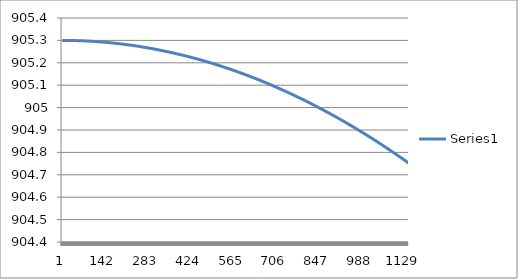
| Category | Series 0 |
|---|---|
| 0 | 905.3 |
| 1 | 905.3 |
| 2 | 905.3 |
| 3 | 905.3 |
| 4 | 905.3 |
| 5 | 905.3 |
| 6 | 905.3 |
| 7 | 905.3 |
| 8 | 905.3 |
| 9 | 905.3 |
| 10 | 905.3 |
| 11 | 905.3 |
| 12 | 905.3 |
| 13 | 905.3 |
| 14 | 905.3 |
| 15 | 905.3 |
| 16 | 905.3 |
| 17 | 905.3 |
| 18 | 905.3 |
| 19 | 905.3 |
| 20 | 905.3 |
| 21 | 905.3 |
| 22 | 905.3 |
| 23 | 905.3 |
| 24 | 905.3 |
| 25 | 905.3 |
| 26 | 905.3 |
| 27 | 905.3 |
| 28 | 905.3 |
| 29 | 905.3 |
| 30 | 905.3 |
| 31 | 905.3 |
| 32 | 905.3 |
| 33 | 905.3 |
| 34 | 905.3 |
| 35 | 905.299 |
| 36 | 905.299 |
| 37 | 905.299 |
| 38 | 905.299 |
| 39 | 905.299 |
| 40 | 905.299 |
| 41 | 905.299 |
| 42 | 905.299 |
| 43 | 905.299 |
| 44 | 905.299 |
| 45 | 905.299 |
| 46 | 905.299 |
| 47 | 905.299 |
| 48 | 905.299 |
| 49 | 905.299 |
| 50 | 905.299 |
| 51 | 905.299 |
| 52 | 905.299 |
| 53 | 905.299 |
| 54 | 905.299 |
| 55 | 905.299 |
| 56 | 905.299 |
| 57 | 905.299 |
| 58 | 905.299 |
| 59 | 905.299 |
| 60 | 905.299 |
| 61 | 905.298 |
| 62 | 905.298 |
| 63 | 905.298 |
| 64 | 905.298 |
| 65 | 905.298 |
| 66 | 905.298 |
| 67 | 905.298 |
| 68 | 905.298 |
| 69 | 905.298 |
| 70 | 905.298 |
| 71 | 905.298 |
| 72 | 905.298 |
| 73 | 905.298 |
| 74 | 905.298 |
| 75 | 905.298 |
| 76 | 905.298 |
| 77 | 905.298 |
| 78 | 905.297 |
| 79 | 905.297 |
| 80 | 905.297 |
| 81 | 905.297 |
| 82 | 905.297 |
| 83 | 905.297 |
| 84 | 905.297 |
| 85 | 905.297 |
| 86 | 905.297 |
| 87 | 905.297 |
| 88 | 905.297 |
| 89 | 905.297 |
| 90 | 905.297 |
| 91 | 905.297 |
| 92 | 905.296 |
| 93 | 905.296 |
| 94 | 905.296 |
| 95 | 905.296 |
| 96 | 905.296 |
| 97 | 905.296 |
| 98 | 905.296 |
| 99 | 905.296 |
| 100 | 905.296 |
| 101 | 905.296 |
| 102 | 905.296 |
| 103 | 905.296 |
| 104 | 905.295 |
| 105 | 905.295 |
| 106 | 905.295 |
| 107 | 905.295 |
| 108 | 905.295 |
| 109 | 905.295 |
| 110 | 905.295 |
| 111 | 905.295 |
| 112 | 905.295 |
| 113 | 905.295 |
| 114 | 905.295 |
| 115 | 905.294 |
| 116 | 905.294 |
| 117 | 905.294 |
| 118 | 905.294 |
| 119 | 905.294 |
| 120 | 905.294 |
| 121 | 905.294 |
| 122 | 905.294 |
| 123 | 905.294 |
| 124 | 905.294 |
| 125 | 905.293 |
| 126 | 905.293 |
| 127 | 905.293 |
| 128 | 905.293 |
| 129 | 905.293 |
| 130 | 905.293 |
| 131 | 905.293 |
| 132 | 905.293 |
| 133 | 905.293 |
| 134 | 905.292 |
| 135 | 905.292 |
| 136 | 905.292 |
| 137 | 905.292 |
| 138 | 905.292 |
| 139 | 905.292 |
| 140 | 905.292 |
| 141 | 905.292 |
| 142 | 905.292 |
| 143 | 905.291 |
| 144 | 905.291 |
| 145 | 905.291 |
| 146 | 905.291 |
| 147 | 905.291 |
| 148 | 905.291 |
| 149 | 905.291 |
| 150 | 905.291 |
| 151 | 905.29 |
| 152 | 905.29 |
| 153 | 905.29 |
| 154 | 905.29 |
| 155 | 905.29 |
| 156 | 905.29 |
| 157 | 905.29 |
| 158 | 905.29 |
| 159 | 905.289 |
| 160 | 905.289 |
| 161 | 905.289 |
| 162 | 905.289 |
| 163 | 905.289 |
| 164 | 905.289 |
| 165 | 905.289 |
| 166 | 905.288 |
| 167 | 905.288 |
| 168 | 905.288 |
| 169 | 905.288 |
| 170 | 905.288 |
| 171 | 905.288 |
| 172 | 905.288 |
| 173 | 905.287 |
| 174 | 905.287 |
| 175 | 905.287 |
| 176 | 905.287 |
| 177 | 905.287 |
| 178 | 905.287 |
| 179 | 905.287 |
| 180 | 905.286 |
| 181 | 905.286 |
| 182 | 905.286 |
| 183 | 905.286 |
| 184 | 905.286 |
| 185 | 905.286 |
| 186 | 905.286 |
| 187 | 905.285 |
| 188 | 905.285 |
| 189 | 905.285 |
| 190 | 905.285 |
| 191 | 905.285 |
| 192 | 905.285 |
| 193 | 905.284 |
| 194 | 905.284 |
| 195 | 905.284 |
| 196 | 905.284 |
| 197 | 905.284 |
| 198 | 905.284 |
| 199 | 905.283 |
| 200 | 905.283 |
| 201 | 905.283 |
| 202 | 905.283 |
| 203 | 905.283 |
| 204 | 905.283 |
| 205 | 905.282 |
| 206 | 905.282 |
| 207 | 905.282 |
| 208 | 905.282 |
| 209 | 905.282 |
| 210 | 905.282 |
| 211 | 905.281 |
| 212 | 905.281 |
| 213 | 905.281 |
| 214 | 905.281 |
| 215 | 905.281 |
| 216 | 905.28 |
| 217 | 905.28 |
| 218 | 905.28 |
| 219 | 905.28 |
| 220 | 905.28 |
| 221 | 905.28 |
| 222 | 905.279 |
| 223 | 905.279 |
| 224 | 905.279 |
| 225 | 905.279 |
| 226 | 905.279 |
| 227 | 905.278 |
| 228 | 905.278 |
| 229 | 905.278 |
| 230 | 905.278 |
| 231 | 905.278 |
| 232 | 905.277 |
| 233 | 905.277 |
| 234 | 905.277 |
| 235 | 905.277 |
| 236 | 905.277 |
| 237 | 905.276 |
| 238 | 905.276 |
| 239 | 905.276 |
| 240 | 905.276 |
| 241 | 905.276 |
| 242 | 905.275 |
| 243 | 905.275 |
| 244 | 905.275 |
| 245 | 905.275 |
| 246 | 905.275 |
| 247 | 905.274 |
| 248 | 905.274 |
| 249 | 905.274 |
| 250 | 905.274 |
| 251 | 905.274 |
| 252 | 905.273 |
| 253 | 905.273 |
| 254 | 905.273 |
| 255 | 905.273 |
| 256 | 905.273 |
| 257 | 905.272 |
| 258 | 905.272 |
| 259 | 905.272 |
| 260 | 905.272 |
| 261 | 905.271 |
| 262 | 905.271 |
| 263 | 905.271 |
| 264 | 905.271 |
| 265 | 905.271 |
| 266 | 905.27 |
| 267 | 905.27 |
| 268 | 905.27 |
| 269 | 905.27 |
| 270 | 905.269 |
| 271 | 905.269 |
| 272 | 905.269 |
| 273 | 905.269 |
| 274 | 905.269 |
| 275 | 905.268 |
| 276 | 905.268 |
| 277 | 905.268 |
| 278 | 905.268 |
| 279 | 905.267 |
| 280 | 905.267 |
| 281 | 905.267 |
| 282 | 905.267 |
| 283 | 905.266 |
| 284 | 905.266 |
| 285 | 905.266 |
| 286 | 905.266 |
| 287 | 905.265 |
| 288 | 905.265 |
| 289 | 905.265 |
| 290 | 905.265 |
| 291 | 905.264 |
| 292 | 905.264 |
| 293 | 905.264 |
| 294 | 905.264 |
| 295 | 905.263 |
| 296 | 905.263 |
| 297 | 905.263 |
| 298 | 905.263 |
| 299 | 905.262 |
| 300 | 905.262 |
| 301 | 905.262 |
| 302 | 905.262 |
| 303 | 905.261 |
| 304 | 905.261 |
| 305 | 905.261 |
| 306 | 905.261 |
| 307 | 905.26 |
| 308 | 905.26 |
| 309 | 905.26 |
| 310 | 905.26 |
| 311 | 905.259 |
| 312 | 905.259 |
| 313 | 905.259 |
| 314 | 905.259 |
| 315 | 905.258 |
| 316 | 905.258 |
| 317 | 905.258 |
| 318 | 905.258 |
| 319 | 905.257 |
| 320 | 905.257 |
| 321 | 905.257 |
| 322 | 905.256 |
| 323 | 905.256 |
| 324 | 905.256 |
| 325 | 905.256 |
| 326 | 905.255 |
| 327 | 905.255 |
| 328 | 905.255 |
| 329 | 905.255 |
| 330 | 905.254 |
| 331 | 905.254 |
| 332 | 905.254 |
| 333 | 905.253 |
| 334 | 905.253 |
| 335 | 905.253 |
| 336 | 905.253 |
| 337 | 905.252 |
| 338 | 905.252 |
| 339 | 905.252 |
| 340 | 905.251 |
| 341 | 905.251 |
| 342 | 905.251 |
| 343 | 905.251 |
| 344 | 905.25 |
| 345 | 905.25 |
| 346 | 905.25 |
| 347 | 905.249 |
| 348 | 905.249 |
| 349 | 905.249 |
| 350 | 905.249 |
| 351 | 905.248 |
| 352 | 905.248 |
| 353 | 905.248 |
| 354 | 905.247 |
| 355 | 905.247 |
| 356 | 905.247 |
| 357 | 905.246 |
| 358 | 905.246 |
| 359 | 905.246 |
| 360 | 905.246 |
| 361 | 905.245 |
| 362 | 905.245 |
| 363 | 905.245 |
| 364 | 905.244 |
| 365 | 905.244 |
| 366 | 905.244 |
| 367 | 905.243 |
| 368 | 905.243 |
| 369 | 905.243 |
| 370 | 905.243 |
| 371 | 905.242 |
| 372 | 905.242 |
| 373 | 905.242 |
| 374 | 905.241 |
| 375 | 905.241 |
| 376 | 905.241 |
| 377 | 905.24 |
| 378 | 905.24 |
| 379 | 905.24 |
| 380 | 905.239 |
| 381 | 905.239 |
| 382 | 905.239 |
| 383 | 905.238 |
| 384 | 905.238 |
| 385 | 905.238 |
| 386 | 905.237 |
| 387 | 905.237 |
| 388 | 905.237 |
| 389 | 905.236 |
| 390 | 905.236 |
| 391 | 905.236 |
| 392 | 905.235 |
| 393 | 905.235 |
| 394 | 905.235 |
| 395 | 905.234 |
| 396 | 905.234 |
| 397 | 905.234 |
| 398 | 905.233 |
| 399 | 905.233 |
| 400 | 905.233 |
| 401 | 905.232 |
| 402 | 905.232 |
| 403 | 905.232 |
| 404 | 905.231 |
| 405 | 905.231 |
| 406 | 905.231 |
| 407 | 905.23 |
| 408 | 905.23 |
| 409 | 905.23 |
| 410 | 905.229 |
| 411 | 905.229 |
| 412 | 905.229 |
| 413 | 905.228 |
| 414 | 905.228 |
| 415 | 905.228 |
| 416 | 905.227 |
| 417 | 905.227 |
| 418 | 905.227 |
| 419 | 905.226 |
| 420 | 905.226 |
| 421 | 905.226 |
| 422 | 905.225 |
| 423 | 905.225 |
| 424 | 905.224 |
| 425 | 905.224 |
| 426 | 905.224 |
| 427 | 905.223 |
| 428 | 905.223 |
| 429 | 905.223 |
| 430 | 905.222 |
| 431 | 905.222 |
| 432 | 905.222 |
| 433 | 905.221 |
| 434 | 905.221 |
| 435 | 905.221 |
| 436 | 905.22 |
| 437 | 905.22 |
| 438 | 905.219 |
| 439 | 905.219 |
| 440 | 905.219 |
| 441 | 905.218 |
| 442 | 905.218 |
| 443 | 905.218 |
| 444 | 905.217 |
| 445 | 905.217 |
| 446 | 905.216 |
| 447 | 905.216 |
| 448 | 905.216 |
| 449 | 905.215 |
| 450 | 905.215 |
| 451 | 905.215 |
| 452 | 905.214 |
| 453 | 905.214 |
| 454 | 905.213 |
| 455 | 905.213 |
| 456 | 905.213 |
| 457 | 905.212 |
| 458 | 905.212 |
| 459 | 905.211 |
| 460 | 905.211 |
| 461 | 905.211 |
| 462 | 905.21 |
| 463 | 905.21 |
| 464 | 905.21 |
| 465 | 905.209 |
| 466 | 905.209 |
| 467 | 905.208 |
| 468 | 905.208 |
| 469 | 905.208 |
| 470 | 905.207 |
| 471 | 905.207 |
| 472 | 905.206 |
| 473 | 905.206 |
| 474 | 905.206 |
| 475 | 905.205 |
| 476 | 905.205 |
| 477 | 905.204 |
| 478 | 905.204 |
| 479 | 905.204 |
| 480 | 905.203 |
| 481 | 905.203 |
| 482 | 905.202 |
| 483 | 905.202 |
| 484 | 905.202 |
| 485 | 905.201 |
| 486 | 905.201 |
| 487 | 905.2 |
| 488 | 905.2 |
| 489 | 905.2 |
| 490 | 905.199 |
| 491 | 905.199 |
| 492 | 905.198 |
| 493 | 905.198 |
| 494 | 905.197 |
| 495 | 905.197 |
| 496 | 905.197 |
| 497 | 905.196 |
| 498 | 905.196 |
| 499 | 905.195 |
| 500 | 905.195 |
| 501 | 905.195 |
| 502 | 905.194 |
| 503 | 905.194 |
| 504 | 905.193 |
| 505 | 905.193 |
| 506 | 905.192 |
| 507 | 905.192 |
| 508 | 905.192 |
| 509 | 905.191 |
| 510 | 905.191 |
| 511 | 905.19 |
| 512 | 905.19 |
| 513 | 905.189 |
| 514 | 905.189 |
| 515 | 905.189 |
| 516 | 905.188 |
| 517 | 905.188 |
| 518 | 905.187 |
| 519 | 905.187 |
| 520 | 905.186 |
| 521 | 905.186 |
| 522 | 905.185 |
| 523 | 905.185 |
| 524 | 905.185 |
| 525 | 905.184 |
| 526 | 905.184 |
| 527 | 905.183 |
| 528 | 905.183 |
| 529 | 905.182 |
| 530 | 905.182 |
| 531 | 905.181 |
| 532 | 905.181 |
| 533 | 905.181 |
| 534 | 905.18 |
| 535 | 905.18 |
| 536 | 905.179 |
| 537 | 905.179 |
| 538 | 905.178 |
| 539 | 905.178 |
| 540 | 905.177 |
| 541 | 905.177 |
| 542 | 905.177 |
| 543 | 905.176 |
| 544 | 905.176 |
| 545 | 905.175 |
| 546 | 905.175 |
| 547 | 905.174 |
| 548 | 905.174 |
| 549 | 905.173 |
| 550 | 905.173 |
| 551 | 905.172 |
| 552 | 905.172 |
| 553 | 905.171 |
| 554 | 905.171 |
| 555 | 905.171 |
| 556 | 905.17 |
| 557 | 905.17 |
| 558 | 905.169 |
| 559 | 905.169 |
| 560 | 905.168 |
| 561 | 905.168 |
| 562 | 905.167 |
| 563 | 905.167 |
| 564 | 905.166 |
| 565 | 905.166 |
| 566 | 905.165 |
| 567 | 905.165 |
| 568 | 905.164 |
| 569 | 905.164 |
| 570 | 905.163 |
| 571 | 905.163 |
| 572 | 905.162 |
| 573 | 905.162 |
| 574 | 905.161 |
| 575 | 905.161 |
| 576 | 905.161 |
| 577 | 905.16 |
| 578 | 905.16 |
| 579 | 905.159 |
| 580 | 905.159 |
| 581 | 905.158 |
| 582 | 905.158 |
| 583 | 905.157 |
| 584 | 905.157 |
| 585 | 905.156 |
| 586 | 905.156 |
| 587 | 905.155 |
| 588 | 905.155 |
| 589 | 905.154 |
| 590 | 905.154 |
| 591 | 905.153 |
| 592 | 905.153 |
| 593 | 905.152 |
| 594 | 905.152 |
| 595 | 905.151 |
| 596 | 905.151 |
| 597 | 905.15 |
| 598 | 905.15 |
| 599 | 905.149 |
| 600 | 905.149 |
| 601 | 905.148 |
| 602 | 905.148 |
| 603 | 905.147 |
| 604 | 905.147 |
| 605 | 905.146 |
| 606 | 905.146 |
| 607 | 905.145 |
| 608 | 905.145 |
| 609 | 905.144 |
| 610 | 905.144 |
| 611 | 905.143 |
| 612 | 905.143 |
| 613 | 905.142 |
| 614 | 905.141 |
| 615 | 905.141 |
| 616 | 905.14 |
| 617 | 905.14 |
| 618 | 905.139 |
| 619 | 905.139 |
| 620 | 905.138 |
| 621 | 905.138 |
| 622 | 905.137 |
| 623 | 905.137 |
| 624 | 905.136 |
| 625 | 905.136 |
| 626 | 905.135 |
| 627 | 905.135 |
| 628 | 905.134 |
| 629 | 905.134 |
| 630 | 905.133 |
| 631 | 905.133 |
| 632 | 905.132 |
| 633 | 905.132 |
| 634 | 905.131 |
| 635 | 905.13 |
| 636 | 905.13 |
| 637 | 905.129 |
| 638 | 905.129 |
| 639 | 905.128 |
| 640 | 905.128 |
| 641 | 905.127 |
| 642 | 905.127 |
| 643 | 905.126 |
| 644 | 905.126 |
| 645 | 905.125 |
| 646 | 905.125 |
| 647 | 905.124 |
| 648 | 905.123 |
| 649 | 905.123 |
| 650 | 905.122 |
| 651 | 905.122 |
| 652 | 905.121 |
| 653 | 905.121 |
| 654 | 905.12 |
| 655 | 905.12 |
| 656 | 905.119 |
| 657 | 905.118 |
| 658 | 905.118 |
| 659 | 905.117 |
| 660 | 905.117 |
| 661 | 905.116 |
| 662 | 905.116 |
| 663 | 905.115 |
| 664 | 905.115 |
| 665 | 905.114 |
| 666 | 905.113 |
| 667 | 905.113 |
| 668 | 905.112 |
| 669 | 905.112 |
| 670 | 905.111 |
| 671 | 905.111 |
| 672 | 905.11 |
| 673 | 905.11 |
| 674 | 905.109 |
| 675 | 905.108 |
| 676 | 905.108 |
| 677 | 905.107 |
| 678 | 905.107 |
| 679 | 905.106 |
| 680 | 905.106 |
| 681 | 905.105 |
| 682 | 905.104 |
| 683 | 905.104 |
| 684 | 905.103 |
| 685 | 905.103 |
| 686 | 905.102 |
| 687 | 905.102 |
| 688 | 905.101 |
| 689 | 905.1 |
| 690 | 905.1 |
| 691 | 905.099 |
| 692 | 905.099 |
| 693 | 905.098 |
| 694 | 905.097 |
| 695 | 905.097 |
| 696 | 905.096 |
| 697 | 905.096 |
| 698 | 905.095 |
| 699 | 905.095 |
| 700 | 905.094 |
| 701 | 905.093 |
| 702 | 905.093 |
| 703 | 905.092 |
| 704 | 905.092 |
| 705 | 905.091 |
| 706 | 905.09 |
| 707 | 905.09 |
| 708 | 905.089 |
| 709 | 905.089 |
| 710 | 905.088 |
| 711 | 905.087 |
| 712 | 905.087 |
| 713 | 905.086 |
| 714 | 905.086 |
| 715 | 905.085 |
| 716 | 905.084 |
| 717 | 905.084 |
| 718 | 905.083 |
| 719 | 905.083 |
| 720 | 905.082 |
| 721 | 905.081 |
| 722 | 905.081 |
| 723 | 905.08 |
| 724 | 905.08 |
| 725 | 905.079 |
| 726 | 905.078 |
| 727 | 905.078 |
| 728 | 905.077 |
| 729 | 905.076 |
| 730 | 905.076 |
| 731 | 905.075 |
| 732 | 905.075 |
| 733 | 905.074 |
| 734 | 905.073 |
| 735 | 905.073 |
| 736 | 905.072 |
| 737 | 905.072 |
| 738 | 905.071 |
| 739 | 905.07 |
| 740 | 905.07 |
| 741 | 905.069 |
| 742 | 905.068 |
| 743 | 905.068 |
| 744 | 905.067 |
| 745 | 905.067 |
| 746 | 905.066 |
| 747 | 905.065 |
| 748 | 905.065 |
| 749 | 905.064 |
| 750 | 905.063 |
| 751 | 905.063 |
| 752 | 905.062 |
| 753 | 905.062 |
| 754 | 905.061 |
| 755 | 905.06 |
| 756 | 905.06 |
| 757 | 905.059 |
| 758 | 905.058 |
| 759 | 905.058 |
| 760 | 905.057 |
| 761 | 905.056 |
| 762 | 905.056 |
| 763 | 905.055 |
| 764 | 905.054 |
| 765 | 905.054 |
| 766 | 905.053 |
| 767 | 905.053 |
| 768 | 905.052 |
| 769 | 905.051 |
| 770 | 905.051 |
| 771 | 905.05 |
| 772 | 905.049 |
| 773 | 905.049 |
| 774 | 905.048 |
| 775 | 905.047 |
| 776 | 905.047 |
| 777 | 905.046 |
| 778 | 905.045 |
| 779 | 905.045 |
| 780 | 905.044 |
| 781 | 905.043 |
| 782 | 905.043 |
| 783 | 905.042 |
| 784 | 905.041 |
| 785 | 905.041 |
| 786 | 905.04 |
| 787 | 905.039 |
| 788 | 905.039 |
| 789 | 905.038 |
| 790 | 905.037 |
| 791 | 905.037 |
| 792 | 905.036 |
| 793 | 905.035 |
| 794 | 905.035 |
| 795 | 905.034 |
| 796 | 905.033 |
| 797 | 905.033 |
| 798 | 905.032 |
| 799 | 905.031 |
| 800 | 905.031 |
| 801 | 905.03 |
| 802 | 905.029 |
| 803 | 905.029 |
| 804 | 905.028 |
| 805 | 905.027 |
| 806 | 905.027 |
| 807 | 905.026 |
| 808 | 905.025 |
| 809 | 905.025 |
| 810 | 905.024 |
| 811 | 905.023 |
| 812 | 905.023 |
| 813 | 905.022 |
| 814 | 905.021 |
| 815 | 905.021 |
| 816 | 905.02 |
| 817 | 905.019 |
| 818 | 905.018 |
| 819 | 905.018 |
| 820 | 905.017 |
| 821 | 905.016 |
| 822 | 905.016 |
| 823 | 905.015 |
| 824 | 905.014 |
| 825 | 905.014 |
| 826 | 905.013 |
| 827 | 905.012 |
| 828 | 905.012 |
| 829 | 905.011 |
| 830 | 905.01 |
| 831 | 905.009 |
| 832 | 905.009 |
| 833 | 905.008 |
| 834 | 905.007 |
| 835 | 905.007 |
| 836 | 905.006 |
| 837 | 905.005 |
| 838 | 905.005 |
| 839 | 905.004 |
| 840 | 905.003 |
| 841 | 905.002 |
| 842 | 905.002 |
| 843 | 905.001 |
| 844 | 905 |
| 845 | 905 |
| 846 | 904.999 |
| 847 | 904.998 |
| 848 | 904.997 |
| 849 | 904.997 |
| 850 | 904.996 |
| 851 | 904.995 |
| 852 | 904.995 |
| 853 | 904.994 |
| 854 | 904.993 |
| 855 | 904.992 |
| 856 | 904.992 |
| 857 | 904.991 |
| 858 | 904.99 |
| 859 | 904.99 |
| 860 | 904.989 |
| 861 | 904.988 |
| 862 | 904.987 |
| 863 | 904.987 |
| 864 | 904.986 |
| 865 | 904.985 |
| 866 | 904.984 |
| 867 | 904.984 |
| 868 | 904.983 |
| 869 | 904.982 |
| 870 | 904.982 |
| 871 | 904.981 |
| 872 | 904.98 |
| 873 | 904.979 |
| 874 | 904.979 |
| 875 | 904.978 |
| 876 | 904.977 |
| 877 | 904.976 |
| 878 | 904.976 |
| 879 | 904.975 |
| 880 | 904.974 |
| 881 | 904.973 |
| 882 | 904.973 |
| 883 | 904.972 |
| 884 | 904.971 |
| 885 | 904.97 |
| 886 | 904.97 |
| 887 | 904.969 |
| 888 | 904.968 |
| 889 | 904.967 |
| 890 | 904.967 |
| 891 | 904.966 |
| 892 | 904.965 |
| 893 | 904.964 |
| 894 | 904.964 |
| 895 | 904.963 |
| 896 | 904.962 |
| 897 | 904.961 |
| 898 | 904.961 |
| 899 | 904.96 |
| 900 | 904.959 |
| 901 | 904.958 |
| 902 | 904.958 |
| 903 | 904.957 |
| 904 | 904.956 |
| 905 | 904.955 |
| 906 | 904.955 |
| 907 | 904.954 |
| 908 | 904.953 |
| 909 | 904.952 |
| 910 | 904.952 |
| 911 | 904.951 |
| 912 | 904.95 |
| 913 | 904.949 |
| 914 | 904.948 |
| 915 | 904.948 |
| 916 | 904.947 |
| 917 | 904.946 |
| 918 | 904.945 |
| 919 | 904.945 |
| 920 | 904.944 |
| 921 | 904.943 |
| 922 | 904.942 |
| 923 | 904.941 |
| 924 | 904.941 |
| 925 | 904.94 |
| 926 | 904.939 |
| 927 | 904.938 |
| 928 | 904.938 |
| 929 | 904.937 |
| 930 | 904.936 |
| 931 | 904.935 |
| 932 | 904.934 |
| 933 | 904.934 |
| 934 | 904.933 |
| 935 | 904.932 |
| 936 | 904.931 |
| 937 | 904.931 |
| 938 | 904.93 |
| 939 | 904.929 |
| 940 | 904.928 |
| 941 | 904.927 |
| 942 | 904.927 |
| 943 | 904.926 |
| 944 | 904.925 |
| 945 | 904.924 |
| 946 | 904.923 |
| 947 | 904.923 |
| 948 | 904.922 |
| 949 | 904.921 |
| 950 | 904.92 |
| 951 | 904.919 |
| 952 | 904.919 |
| 953 | 904.918 |
| 954 | 904.917 |
| 955 | 904.916 |
| 956 | 904.915 |
| 957 | 904.915 |
| 958 | 904.914 |
| 959 | 904.913 |
| 960 | 904.912 |
| 961 | 904.911 |
| 962 | 904.911 |
| 963 | 904.91 |
| 964 | 904.909 |
| 965 | 904.908 |
| 966 | 904.907 |
| 967 | 904.906 |
| 968 | 904.906 |
| 969 | 904.905 |
| 970 | 904.904 |
| 971 | 904.903 |
| 972 | 904.902 |
| 973 | 904.902 |
| 974 | 904.901 |
| 975 | 904.9 |
| 976 | 904.899 |
| 977 | 904.898 |
| 978 | 904.897 |
| 979 | 904.897 |
| 980 | 904.896 |
| 981 | 904.895 |
| 982 | 904.894 |
| 983 | 904.893 |
| 984 | 904.892 |
| 985 | 904.892 |
| 986 | 904.891 |
| 987 | 904.89 |
| 988 | 904.889 |
| 989 | 904.888 |
| 990 | 904.887 |
| 991 | 904.887 |
| 992 | 904.886 |
| 993 | 904.885 |
| 994 | 904.884 |
| 995 | 904.883 |
| 996 | 904.882 |
| 997 | 904.882 |
| 998 | 904.881 |
| 999 | 904.88 |
| 1000 | 904.879 |
| 1001 | 904.878 |
| 1002 | 904.877 |
| 1003 | 904.877 |
| 1004 | 904.876 |
| 1005 | 904.875 |
| 1006 | 904.874 |
| 1007 | 904.873 |
| 1008 | 904.872 |
| 1009 | 904.871 |
| 1010 | 904.871 |
| 1011 | 904.87 |
| 1012 | 904.869 |
| 1013 | 904.868 |
| 1014 | 904.867 |
| 1015 | 904.866 |
| 1016 | 904.865 |
| 1017 | 904.865 |
| 1018 | 904.864 |
| 1019 | 904.863 |
| 1020 | 904.862 |
| 1021 | 904.861 |
| 1022 | 904.86 |
| 1023 | 904.859 |
| 1024 | 904.859 |
| 1025 | 904.858 |
| 1026 | 904.857 |
| 1027 | 904.856 |
| 1028 | 904.855 |
| 1029 | 904.854 |
| 1030 | 904.853 |
| 1031 | 904.853 |
| 1032 | 904.852 |
| 1033 | 904.851 |
| 1034 | 904.85 |
| 1035 | 904.849 |
| 1036 | 904.848 |
| 1037 | 904.847 |
| 1038 | 904.846 |
| 1039 | 904.846 |
| 1040 | 904.845 |
| 1041 | 904.844 |
| 1042 | 904.843 |
| 1043 | 904.842 |
| 1044 | 904.841 |
| 1045 | 904.84 |
| 1046 | 904.839 |
| 1047 | 904.839 |
| 1048 | 904.838 |
| 1049 | 904.837 |
| 1050 | 904.836 |
| 1051 | 904.835 |
| 1052 | 904.834 |
| 1053 | 904.833 |
| 1054 | 904.832 |
| 1055 | 904.831 |
| 1056 | 904.831 |
| 1057 | 904.83 |
| 1058 | 904.829 |
| 1059 | 904.828 |
| 1060 | 904.827 |
| 1061 | 904.826 |
| 1062 | 904.825 |
| 1063 | 904.824 |
| 1064 | 904.823 |
| 1065 | 904.823 |
| 1066 | 904.822 |
| 1067 | 904.821 |
| 1068 | 904.82 |
| 1069 | 904.819 |
| 1070 | 904.818 |
| 1071 | 904.817 |
| 1072 | 904.816 |
| 1073 | 904.815 |
| 1074 | 904.814 |
| 1075 | 904.813 |
| 1076 | 904.813 |
| 1077 | 904.812 |
| 1078 | 904.811 |
| 1079 | 904.81 |
| 1080 | 904.809 |
| 1081 | 904.808 |
| 1082 | 904.807 |
| 1083 | 904.806 |
| 1084 | 904.805 |
| 1085 | 904.804 |
| 1086 | 904.803 |
| 1087 | 904.803 |
| 1088 | 904.802 |
| 1089 | 904.801 |
| 1090 | 904.8 |
| 1091 | 904.799 |
| 1092 | 904.798 |
| 1093 | 904.797 |
| 1094 | 904.796 |
| 1095 | 904.795 |
| 1096 | 904.794 |
| 1097 | 904.793 |
| 1098 | 904.792 |
| 1099 | 904.792 |
| 1100 | 904.791 |
| 1101 | 904.79 |
| 1102 | 904.789 |
| 1103 | 904.788 |
| 1104 | 904.787 |
| 1105 | 904.786 |
| 1106 | 904.785 |
| 1107 | 904.784 |
| 1108 | 904.783 |
| 1109 | 904.782 |
| 1110 | 904.781 |
| 1111 | 904.78 |
| 1112 | 904.779 |
| 1113 | 904.778 |
| 1114 | 904.778 |
| 1115 | 904.777 |
| 1116 | 904.776 |
| 1117 | 904.775 |
| 1118 | 904.774 |
| 1119 | 904.773 |
| 1120 | 904.772 |
| 1121 | 904.771 |
| 1122 | 904.77 |
| 1123 | 904.769 |
| 1124 | 904.768 |
| 1125 | 904.767 |
| 1126 | 904.766 |
| 1127 | 904.765 |
| 1128 | 904.764 |
| 1129 | 904.763 |
| 1130 | 904.762 |
| 1131 | 904.761 |
| 1132 | 904.76 |
| 1133 | 904.76 |
| 1134 | 904.759 |
| 1135 | 904.758 |
| 1136 | 904.757 |
| 1137 | 904.756 |
| 1138 | 904.755 |
| 1139 | 904.754 |
| 1140 | 904.753 |
| 1141 | 904.752 |